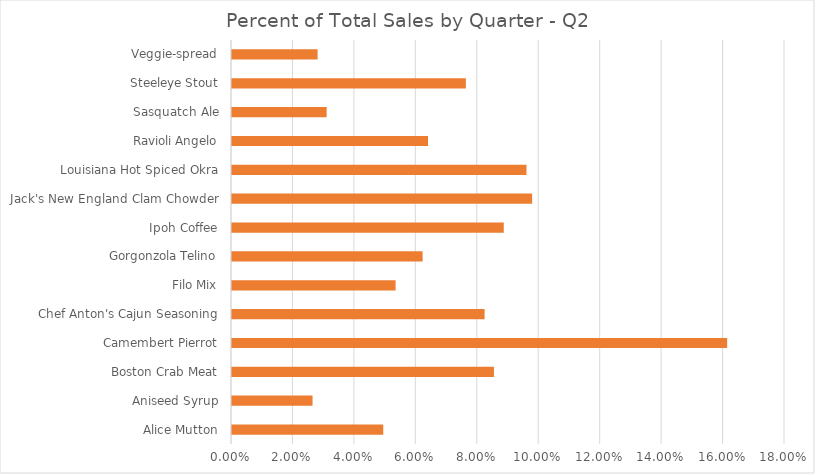
| Category | Percent of Q2 |
|---|---|
| Alice Mutton | 0.049 |
| Aniseed Syrup | 0.026 |
| Boston Crab Meat | 0.085 |
| Camembert Pierrot | 0.161 |
| Chef Anton's Cajun Seasoning | 0.082 |
| Filo Mix | 0.053 |
| Gorgonzola Telino | 0.062 |
| Ipoh Coffee | 0.088 |
| Jack's New England Clam Chowder | 0.098 |
| Louisiana Hot Spiced Okra | 0.096 |
| Ravioli Angelo | 0.064 |
| Sasquatch Ale | 0.031 |
| Steeleye Stout | 0.076 |
| Veggie-spread | 0.028 |